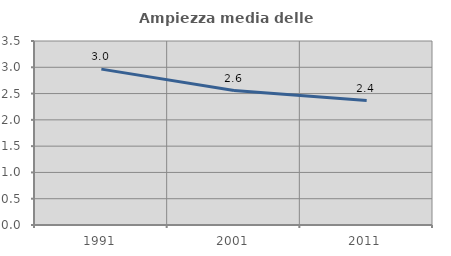
| Category | Ampiezza media delle famiglie |
|---|---|
| 1991.0 | 2.965 |
| 2001.0 | 2.558 |
| 2011.0 | 2.366 |